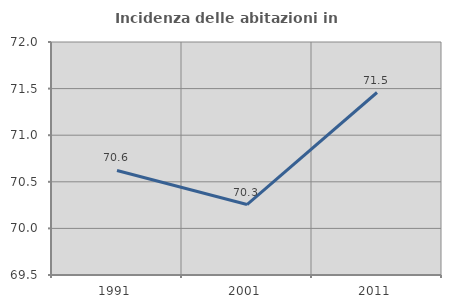
| Category | Incidenza delle abitazioni in proprietà  |
|---|---|
| 1991.0 | 70.621 |
| 2001.0 | 70.256 |
| 2011.0 | 71.458 |